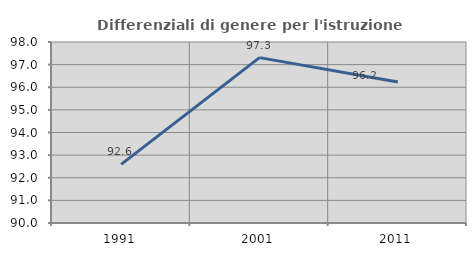
| Category | Differenziali di genere per l'istruzione superiore |
|---|---|
| 1991.0 | 92.592 |
| 2001.0 | 97.31 |
| 2011.0 | 96.229 |